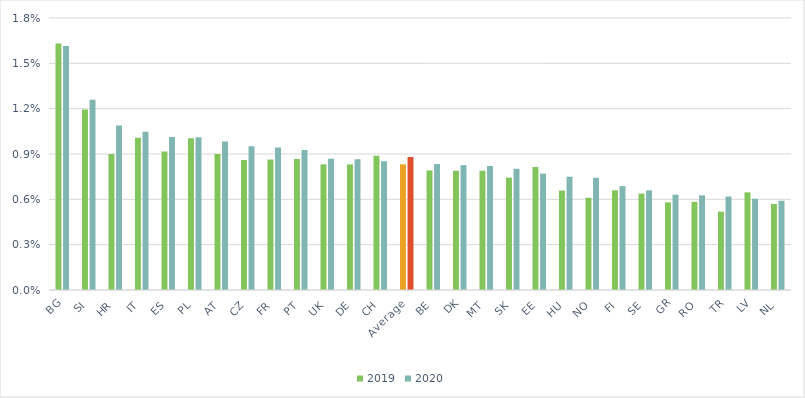
| Category | 2019 | 2020 |
|---|---|---|
| BG | 0.016 | 0.016 |
| SI | 0.012 | 0.013 |
| HR | 0.009 | 0.011 |
| IT | 0.01 | 0.01 |
| ES | 0.009 | 0.01 |
| PL | 0.01 | 0.01 |
| AT | 0.009 | 0.01 |
| CZ | 0.009 | 0.01 |
| FR | 0.009 | 0.009 |
| PT | 0.009 | 0.009 |
| UK | 0.008 | 0.009 |
| DE | 0.008 | 0.009 |
| CH | 0.009 | 0.009 |
| Average | 0.008 | 0.009 |
| BE | 0.008 | 0.008 |
| DK | 0.008 | 0.008 |
| MT | 0.008 | 0.008 |
| SK | 0.007 | 0.008 |
| EE | 0.008 | 0.008 |
| HU | 0.007 | 0.008 |
| NO | 0.006 | 0.007 |
| FI | 0.007 | 0.007 |
| SE | 0.006 | 0.007 |
| GR | 0.006 | 0.006 |
| RO | 0.006 | 0.006 |
| TR | 0.005 | 0.006 |
| LV | 0.006 | 0.006 |
| NL | 0.006 | 0.006 |